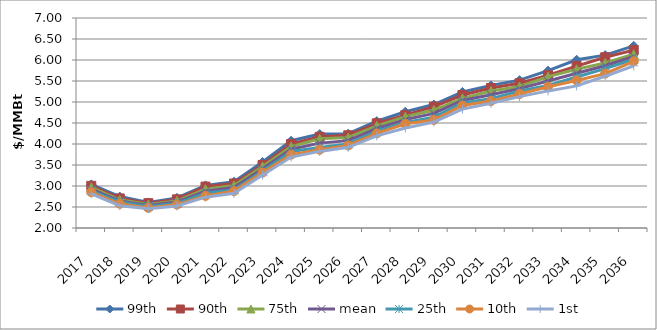
| Category | 99th | 90th | 75th | mean | 25th | 10th | 1st |
|---|---|---|---|---|---|---|---|
| 2017.0 | 3.039 | 3.004 | 2.968 | 2.925 | 2.885 | 2.853 | 2.814 |
| 2018.0 | 2.748 | 2.704 | 2.67 | 2.642 | 2.617 | 2.576 | 2.531 |
| 2019.0 | 2.609 | 2.591 | 2.56 | 2.535 | 2.51 | 2.478 | 2.461 |
| 2020.0 | 2.717 | 2.682 | 2.646 | 2.618 | 2.585 | 2.557 | 2.525 |
| 2021.0 | 3.015 | 2.986 | 2.925 | 2.874 | 2.825 | 2.764 | 2.734 |
| 2022.0 | 3.102 | 3.059 | 3.013 | 2.963 | 2.911 | 2.879 | 2.825 |
| 2023.0 | 3.571 | 3.501 | 3.463 | 3.412 | 3.36 | 3.319 | 3.261 |
| 2024.0 | 4.078 | 4.001 | 3.939 | 3.876 | 3.822 | 3.747 | 3.689 |
| 2025.0 | 4.236 | 4.171 | 4.125 | 4.021 | 3.915 | 3.864 | 3.824 |
| 2026.0 | 4.245 | 4.207 | 4.156 | 4.08 | 4.002 | 3.965 | 3.921 |
| 2027.0 | 4.544 | 4.493 | 4.433 | 4.369 | 4.305 | 4.252 | 4.194 |
| 2028.0 | 4.768 | 4.688 | 4.647 | 4.58 | 4.512 | 4.482 | 4.381 |
| 2029.0 | 4.939 | 4.89 | 4.809 | 4.728 | 4.64 | 4.572 | 4.525 |
| 2030.0 | 5.239 | 5.166 | 5.088 | 5.037 | 4.977 | 4.916 | 4.831 |
| 2031.0 | 5.395 | 5.334 | 5.261 | 5.173 | 5.08 | 5.022 | 4.968 |
| 2032.0 | 5.52 | 5.446 | 5.37 | 5.318 | 5.262 | 5.19 | 5.128 |
| 2033.0 | 5.746 | 5.637 | 5.604 | 5.498 | 5.395 | 5.365 | 5.264 |
| 2034.0 | 6.006 | 5.856 | 5.778 | 5.685 | 5.595 | 5.514 | 5.383 |
| 2035.0 | 6.116 | 6.065 | 5.928 | 5.864 | 5.795 | 5.676 | 5.614 |
| 2036.0 | 6.337 | 6.236 | 6.137 | 6.084 | 6.017 | 5.97 | 5.862 |